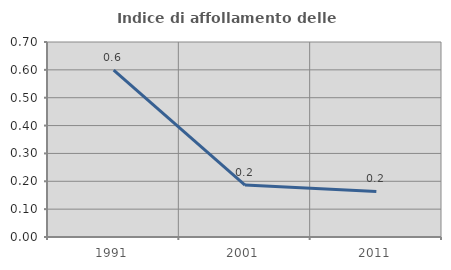
| Category | Indice di affollamento delle abitazioni  |
|---|---|
| 1991.0 | 0.599 |
| 2001.0 | 0.187 |
| 2011.0 | 0.163 |